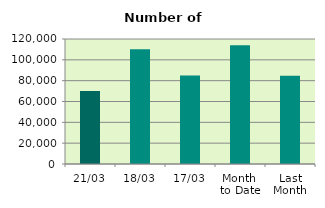
| Category | Series 0 |
|---|---|
| 21/03 | 70100 |
| 18/03 | 110116 |
| 17/03 | 84956 |
| Month 
to Date | 113955.467 |
| Last
Month | 84726.4 |